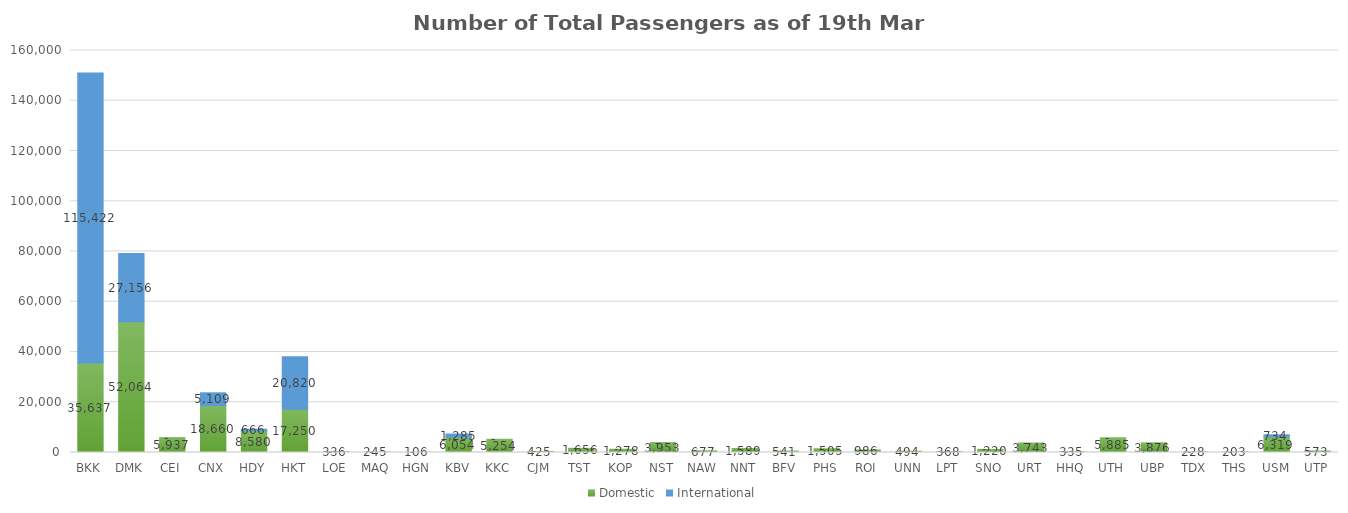
| Category | Domestic | International |
|---|---|---|
| BKK | 35637 | 115422 |
| DMK | 52064 | 27156 |
| CEI | 5937 | 0 |
| CNX | 18660 | 5109 |
| HDY | 8580 | 666 |
| HKT | 17250 | 20820 |
| LOE | 336 | 0 |
| MAQ | 245 | 0 |
| HGN | 106 | 0 |
| KBV | 6054 | 1285 |
| KKC | 5254 | 0 |
| CJM | 425 | 0 |
| TST | 1656 | 0 |
| KOP | 1278 | 0 |
| NST | 3953 | 0 |
| NAW | 677 | 0 |
| NNT | 1589 | 0 |
| BFV | 541 | 0 |
| PHS | 1505 | 0 |
| ROI | 986 | 0 |
| UNN | 494 | 0 |
| LPT | 368 | 0 |
| SNO | 1220 | 0 |
| URT | 3743 | 0 |
| HHQ | 335 | 0 |
| UTH | 5885 | 0 |
| UBP | 3876 | 0 |
| TDX | 228 | 0 |
| THS | 203 | 0 |
| USM | 6319 | 734 |
| UTP | 573 | 0 |